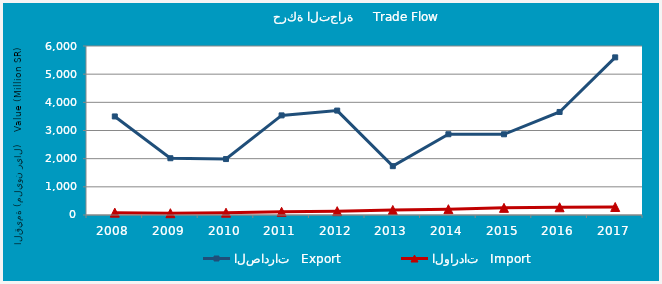
| Category | الصادرات   Export | الواردات   Import |
|---|---|---|
| 2008.0 | 3499043497 | 83393858 |
| 2009.0 | 2014898659 | 63434323 |
| 2010.0 | 1986501619 | 82389430 |
| 2011.0 | 3536494804 | 114259731 |
| 2012.0 | 3707114445 | 136962983 |
| 2013.0 | 1733775342 | 178412424 |
| 2014.0 | 2867004134 | 205463722 |
| 2015.0 | 2865686887 | 253778032 |
| 2016.0 | 3657943759 | 274869956 |
| 2017.0 | 5596564386 | 284413527 |